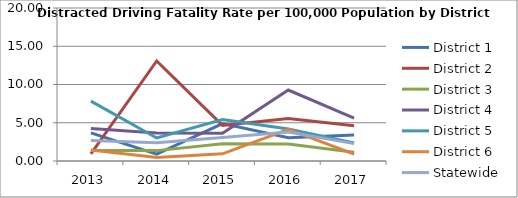
| Category | District 1 | District 2 | District 3 | District 4 | District 5 | District 6 | Statewide |
|---|---|---|---|---|---|---|---|
| 2013.0 | 3.677 | 0.938 | 1.384 | 4.236 | 7.825 | 1.425 | 2.667 |
| 2014.0 | 0.903 | 13.08 | 1.357 | 3.675 | 3.008 | 0.471 | 2.386 |
| 2015.0 | 4.889 | 4.656 | 2.268 | 3.638 | 5.408 | 0.934 | 3.082 |
| 2016.0 | 3.043 | 5.552 | 2.222 | 9.281 | 4.171 | 4.125 | 3.802 |
| 2017.0 | 3.407 | 4.607 | 1.147 | 5.592 | 2.355 | 0.9 | 2.271 |